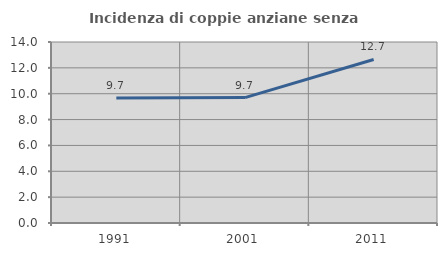
| Category | Incidenza di coppie anziane senza figli  |
|---|---|
| 1991.0 | 9.669 |
| 2001.0 | 9.699 |
| 2011.0 | 12.651 |